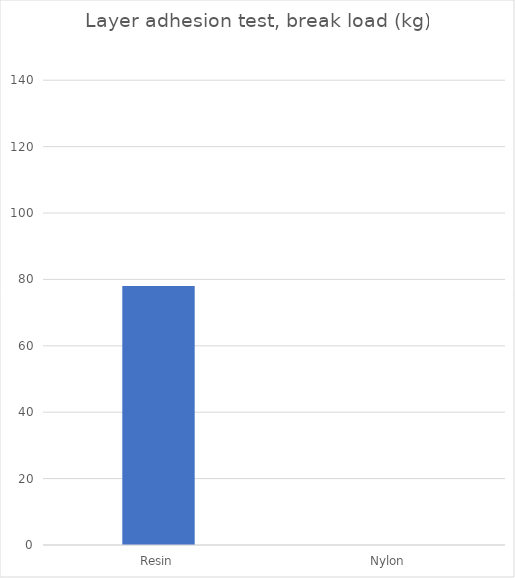
| Category | Average |
|---|---|
| Resin | 78 |
| Nylon | 0 |